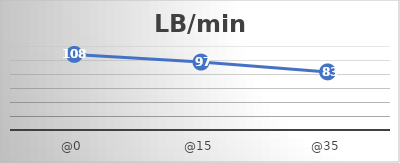
| Category | LB/min |
|---|---|
| @0 | 108 |
| @15 | 97 |
| @35 | 83 |